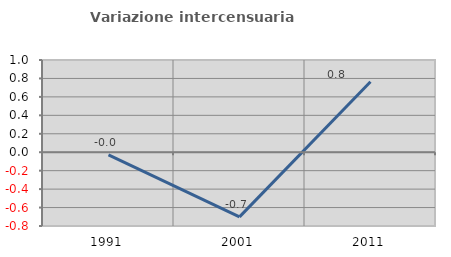
| Category | Variazione intercensuaria annua |
|---|---|
| 1991.0 | -0.029 |
| 2001.0 | -0.701 |
| 2011.0 | 0.764 |